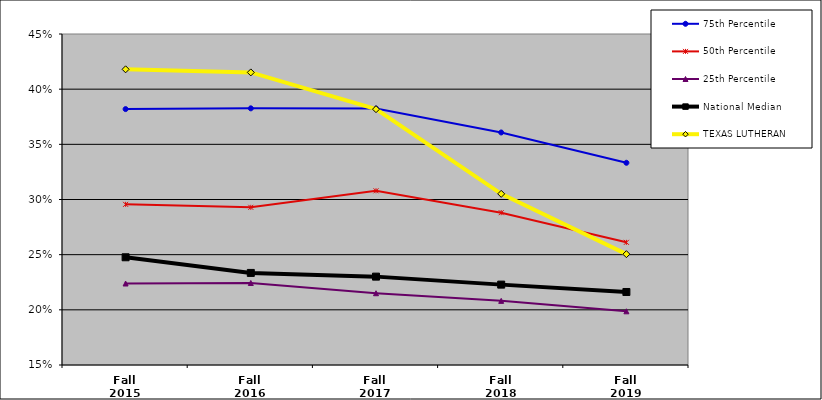
| Category | 75th Percentile | 50th Percentile | 25th Percentile | National Median | TEXAS LUTHERAN |
|---|---|---|---|---|---|
| Fall 2015 | 0.382 | 0.296 | 0.224 | 0.248 | 0.418 |
| Fall 2016 | 0.383 | 0.293 | 0.224 | 0.233 | 0.415 |
| Fall 2017 | 0.382 | 0.308 | 0.215 | 0.23 | 0.382 |
| Fall 2018 | 0.361 | 0.288 | 0.208 | 0.223 | 0.305 |
| Fall 2019 | 0.333 | 0.261 | 0.199 | 0.216 | 0.25 |